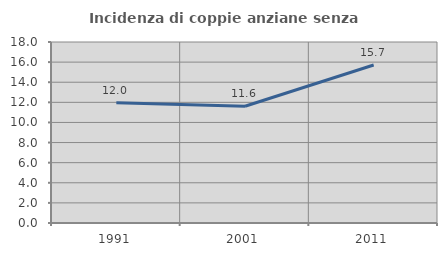
| Category | Incidenza di coppie anziane senza figli  |
|---|---|
| 1991.0 | 11.954 |
| 2001.0 | 11.614 |
| 2011.0 | 15.709 |